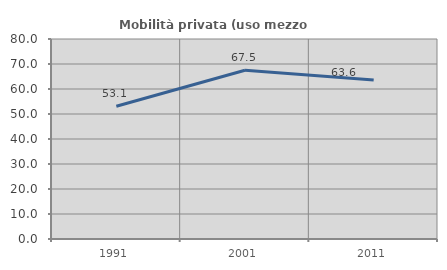
| Category | Mobilità privata (uso mezzo privato) |
|---|---|
| 1991.0 | 53.125 |
| 2001.0 | 67.5 |
| 2011.0 | 63.636 |